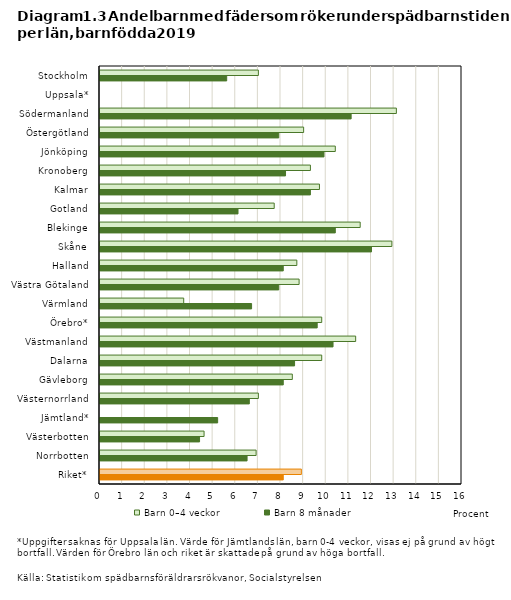
| Category | Barn 0–4 veckor | Barn 8 månader |
|---|---|---|
| Stockholm | 7 | 5.6 |
| Uppsala* | 0 | 0 |
| Södermanland | 13.1 | 11.1 |
| Östergötland | 9 | 7.9 |
| Jönköping | 10.4 | 9.9 |
| Kronoberg | 9.3 | 8.2 |
| Kalmar | 9.7 | 9.3 |
| Gotland | 7.7 | 6.1 |
| Blekinge | 11.5 | 10.4 |
| Skåne | 12.9 | 12 |
| Halland | 8.7 | 8.1 |
| Västra Götaland | 8.8 | 7.9 |
| Värmland | 3.7 | 6.7 |
| Örebro* | 9.8 | 9.6 |
| Västmanland | 11.3 | 10.3 |
| Dalarna | 9.8 | 8.6 |
| Gävleborg | 8.5 | 8.1 |
| Västernorrland | 7 | 6.6 |
| Jämtland* | 0 | 5.2 |
| Västerbotten | 4.6 | 4.4 |
| Norrbotten | 6.9 | 6.5 |
| Riket* | 8.9 | 8.1 |